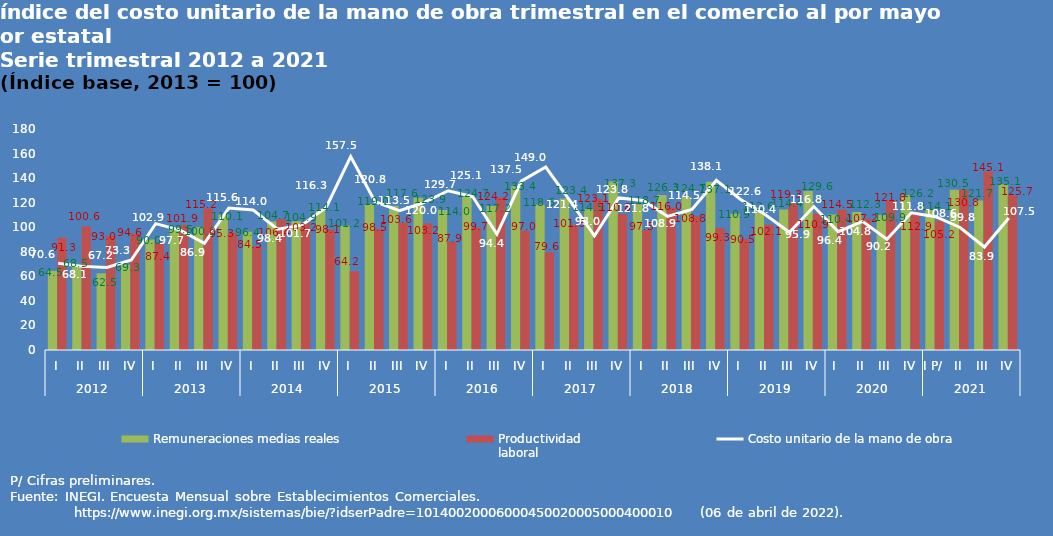
| Category | Remuneraciones medias reales | Productividad 
laboral |
|---|---|---|
| 0 | 64.455 | 91.326 |
| 1 | 68.533 | 100.62 |
| 2 | 62.479 | 93.001 |
| 3 | 69.342 | 94.616 |
| 4 | 90.003 | 87.433 |
| 5 | 99.528 | 101.898 |
| 6 | 100.199 | 115.247 |
| 7 | 110.142 | 95.267 |
| 8 | 96.351 | 84.526 |
| 9 | 104.681 | 106.407 |
| 10 | 104.89 | 103.183 |
| 11 | 114.144 | 98.111 |
| 12 | 101.172 | 64.22 |
| 13 | 118.967 | 98.491 |
| 14 | 117.569 | 103.555 |
| 15 | 123.943 | 103.244 |
| 16 | 114.003 | 87.877 |
| 17 | 124.73 | 99.734 |
| 18 | 117.243 | 124.205 |
| 19 | 133.434 | 97.035 |
| 20 | 118.585 | 79.588 |
| 21 | 123.426 | 101.633 |
| 22 | 114.538 | 123.11 |
| 23 | 137.266 | 110.847 |
| 24 | 118.719 | 97.502 |
| 25 | 126.315 | 116.02 |
| 26 | 124.656 | 108.849 |
| 27 | 137.128 | 99.289 |
| 28 | 110.888 | 90.469 |
| 29 | 112.648 | 102.075 |
| 30 | 114.405 | 119.32 |
| 31 | 129.593 | 110.915 |
| 32 | 110.402 | 114.533 |
| 33 | 112.334 | 107.199 |
| 34 | 109.905 | 121.848 |
| 35 | 126.177 | 112.879 |
| 36 | 114.126 | 105.183 |
| 37 | 130.514 | 130.776 |
| 38 | 121.716 | 145.149 |
| 39 | 135.054 | 125.687 |